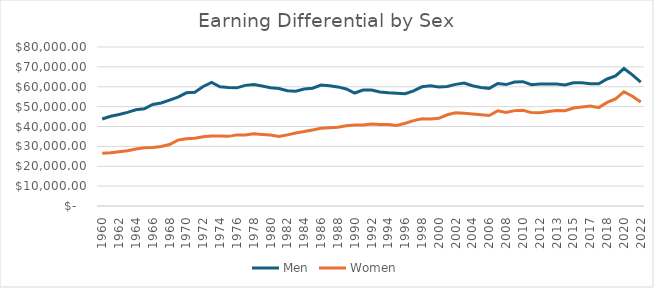
| Category | Men | Women |
|---|---|---|
| 1960.0 | 43770 | 26560 |
| 1961.0 | 45170 | 26770 |
| 1962.0 | 46000 | 27280 |
| 1963.0 | 47120 | 27780 |
| 1964.0 | 48410 | 28640 |
| 1965.0 | 48930 | 29320 |
| 1966.0 | 51080 | 29400 |
| 1967.0 | 51860 | 29960 |
| 1968.0 | 53230 | 30950 |
| 1969.0 | 54810 | 33160 |
| 1970.0 | 56960 | 33820 |
| 1971.0 | 57270 | 34080 |
| 1972.0 | 60150 | 34800 |
| 1973.0 | 62150 | 35200 |
| 1974.0 | 60010 | 35260 |
| 1975.0 | 59570 | 35040 |
| 1976.0 | 59440 | 35780 |
| 1977.0 | 60690 | 35760 |
| 1978.0 | 61090 | 36310 |
| 1979.0 | 60360 | 36010 |
| 1980.0 | 59460 | 35770 |
| 1981.0 | 59090 | 35000 |
| 1982.0 | 57960 | 35790 |
| 1983.0 | 57750 | 36730 |
| 1984.0 | 58820 | 37440 |
| 1985.0 | 59280 | 38280 |
| 1986.0 | 60870 | 39120 |
| 1987.0 | 60490 | 39430 |
| 1988.0 | 59930 | 39580 |
| 1989.0 | 58860 | 40420 |
| 1990.0 | 56850 | 40710 |
| 1991.0 | 58310 | 40730 |
| 1992.0 | 58360 | 41310 |
| 1993.0 | 57350 | 41020 |
| 1994.0 | 56950 | 40980 |
| 1995.0 | 56790 | 40560 |
| 1996.0 | 56470 | 41650 |
| 1997.0 | 57910 | 42950 |
| 1998.0 | 59970 | 43880 |
| 1999.0 | 60490 | 43740 |
| 2000.0 | 59860 | 44130 |
| 2001.0 | 60150 | 45910 |
| 2002.0 | 61200 | 46880 |
| 2003.0 | 61830 | 46710 |
| 2004.0 | 60510 | 46340 |
| 2005.0 | 59660 | 45920 |
| 2006.0 | 59200 | 45550 |
| 2007.0 | 61620 | 47940 |
| 2008.0 | 61090 | 47100 |
| 2009.0 | 62340 | 47990 |
| 2010.0 | 62570 | 48140 |
| 2011.0 | 61010 | 46980 |
| 2012.0 | 61340 | 46920 |
| 2013.0 | 61360 | 47590 |
| 2013.0 | 61380 | 48040 |
| 2014.0 | 60940 | 47930 |
| 2015.0 | 61990 | 49320 |
| 2016.0 | 61960 | 49860 |
| 2017.0 | 61530 | 50250 |
| 2017.0 | 61490 | 49500 |
| 2018.0 | 63910 | 52130 |
| 2019.0 | 65440 | 53870 |
| 2020.0 | 69160 | 57500 |
| 2021.0 | 65970 | 55240 |
| 2022.0 | 62350 | 52360 |